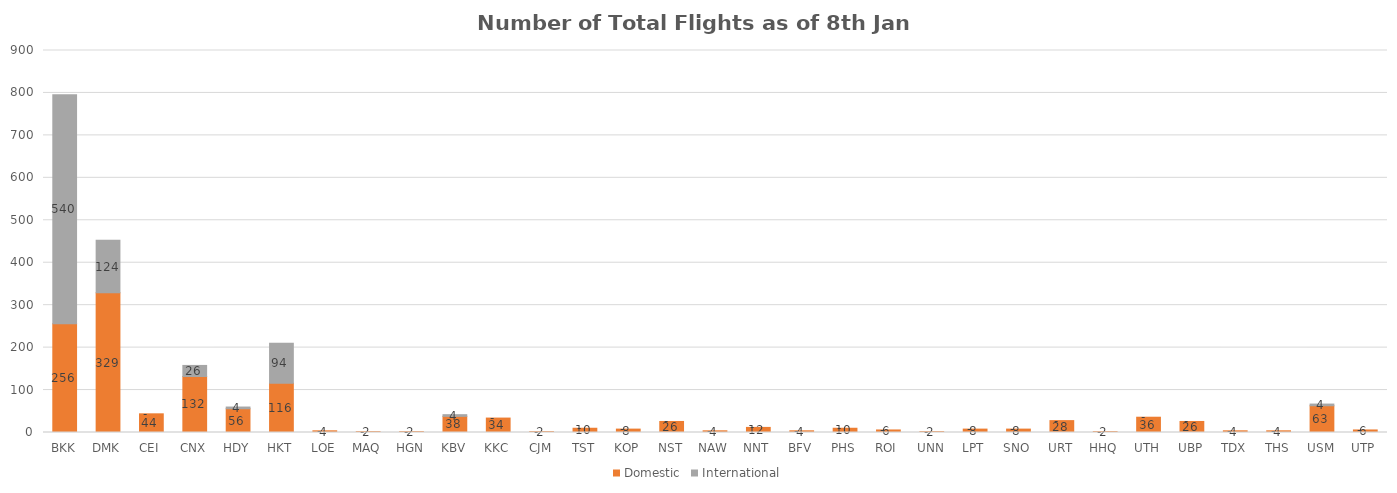
| Category | Domestic | International |
|---|---|---|
| BKK | 256 | 540 |
| DMK | 329 | 124 |
| CEI | 44 | 0 |
| CNX | 132 | 26 |
| HDY | 56 | 4 |
| HKT | 116 | 94 |
| LOE | 4 | 0 |
| MAQ | 2 | 0 |
| HGN | 2 | 0 |
| KBV | 38 | 4 |
| KKC | 34 | 0 |
| CJM | 2 | 0 |
| TST | 10 | 0 |
| KOP | 8 | 0 |
| NST | 26 | 0 |
| NAW | 4 | 0 |
| NNT | 12 | 0 |
| BFV | 4 | 0 |
| PHS | 10 | 0 |
| ROI | 6 | 0 |
| UNN | 2 | 0 |
| LPT | 8 | 0 |
| SNO | 8 | 0 |
| URT | 28 | 0 |
| HHQ | 2 | 0 |
| UTH | 36 | 0 |
| UBP | 26 | 0 |
| TDX | 4 | 0 |
| THS | 4 | 0 |
| USM | 63 | 4 |
| UTP | 6 | 0 |